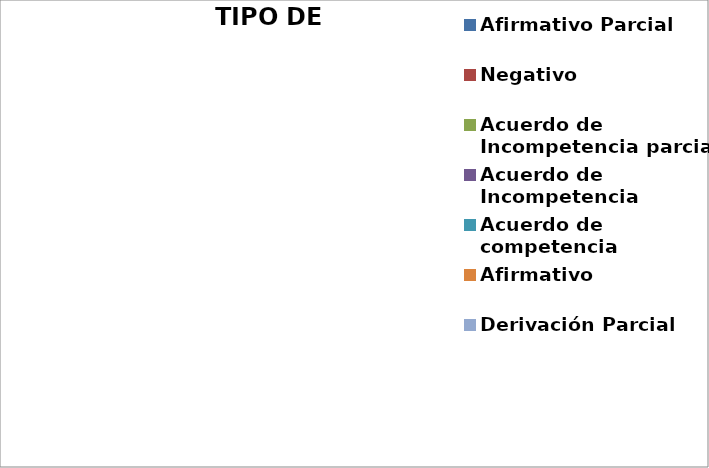
| Category | Series 0 |
|---|---|
| Afirmativo Parcial | 0 |
| Negativo | 0 |
| Acuerdo de Incompetencia parcial | 0 |
| Acuerdo de Incompetencia | 0 |
| Acuerdo de competencia | 0 |
| Afirmativo | 0 |
| Derivación Parcial | 0 |